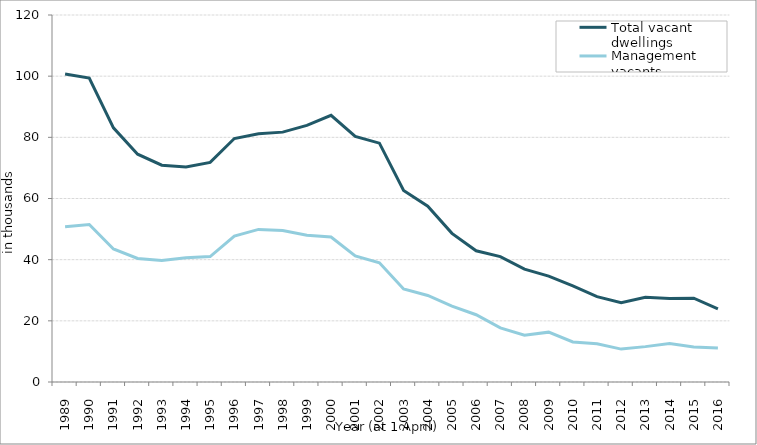
| Category | Total vacant dwellings  | Management vacants |
|---|---|---|
| 1989.0 | 100.7 | 50.8 |
| 1990.0 | 99.4 | 51.5 |
| 1991.0 | 83.1 | 43.5 |
| 1992.0 | 74.5 | 40.4 |
| 1993.0 | 70.9 | 39.7 |
| 1994.0 | 70.3 | 40.6 |
| 1995.0 | 71.8 | 41 |
| 1996.0 | 79.6 | 47.7 |
| 1997.0 | 81.2 | 49.9 |
| 1998.0 | 81.7 | 49.5 |
| 1999.0 | 83.9 | 48 |
| 2000.0 | 87.2 | 47.4 |
| 2001.0 | 80.3 | 41.2 |
| 2002.0 | 78.1 | 39 |
| 2003.0 | 62.6 | 30.4 |
| 2004.0 | 57.5 | 28.3 |
| 2005.0 | 48.6 | 24.8 |
| 2006.0 | 42.9 | 22 |
| 2007.0 | 41 | 17.7 |
| 2008.0 | 36.9 | 15.3 |
| 2009.0 | 34.6 | 16.3 |
| 2010.0 | 31.4 | 13.1 |
| 2011.0 | 27.9 | 12.5 |
| 2012.0 | 25.899 | 10.759 |
| 2013.0 | 27.681 | 11.564 |
| 2014.0 | 27.318 | 12.609 |
| 2015.0 | 27.421 | 11.44 |
| 2016.0 | 23.928 | 11.096 |